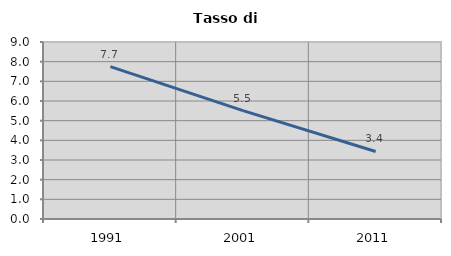
| Category | Tasso di disoccupazione   |
|---|---|
| 1991.0 | 7.746 |
| 2001.0 | 5.508 |
| 2011.0 | 3.435 |